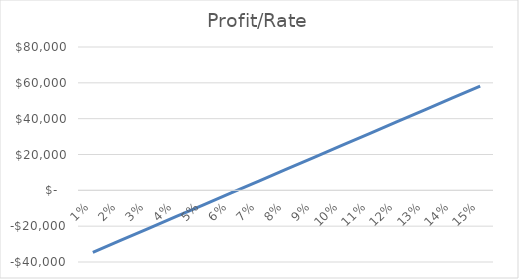
| Category |  $-    |
|---|---|
| 0.01 | -34620 |
| 0.02 | -27990 |
| 0.03 | -21360 |
| 0.04 | -14730 |
| 0.05 | -8100 |
| 0.06 | -1470 |
| 0.07 | 5160 |
| 0.08 | 11790 |
| 0.09 | 18420 |
| 0.1 | 25050 |
| 0.11 | 31680 |
| 0.12 | 38310 |
| 0.13 | 44940 |
| 0.14 | 51570 |
| 0.15 | 58200 |